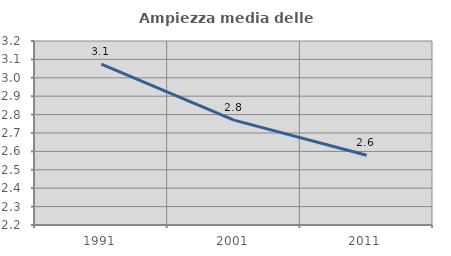
| Category | Ampiezza media delle famiglie |
|---|---|
| 1991.0 | 3.074 |
| 2001.0 | 2.77 |
| 2011.0 | 2.579 |